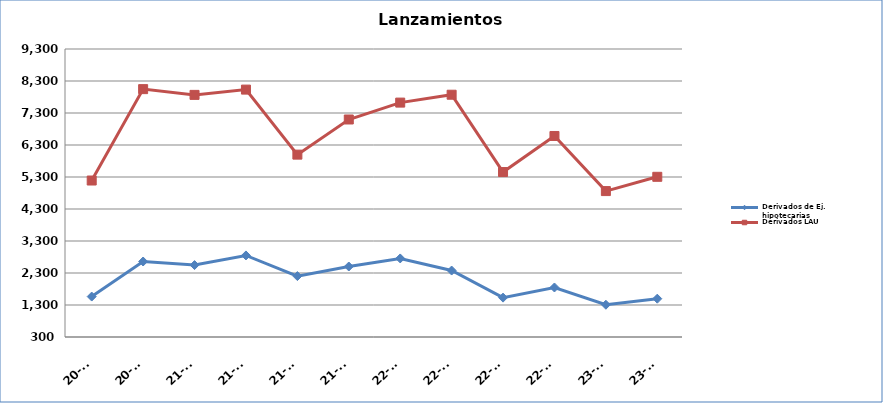
| Category | Derivados de Ej. hipotecarias | Derivados LAU |
|---|---|---|
| 20-T3 | 1564 | 5190 |
| 20-T4 | 2659 | 8046 |
| 21-T1 | 2548 | 7866 |
| 21-T2 | 2849 | 8031 |
| 21-T3 | 2203 | 5999 |
| 21-T4 | 2503 | 7097 |
| 22-T1 | 2755 | 7625 |
| 22-T2 | 2377 | 7871 |
| 22-T3 | 1530 | 5455 |
| 22-T4 | 1847 | 6582 |
| 23-T1 | 1308 | 4860 |
| 23-T2 | 1497 | 5306 |